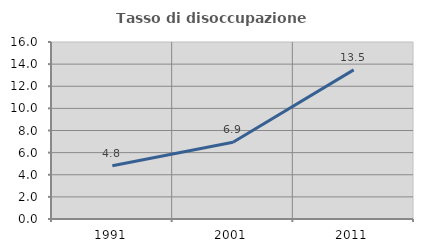
| Category | Tasso di disoccupazione giovanile  |
|---|---|
| 1991.0 | 4.808 |
| 2001.0 | 6.944 |
| 2011.0 | 13.483 |